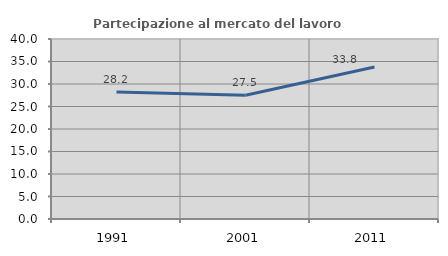
| Category | Partecipazione al mercato del lavoro  femminile |
|---|---|
| 1991.0 | 28.205 |
| 2001.0 | 27.5 |
| 2011.0 | 33.784 |